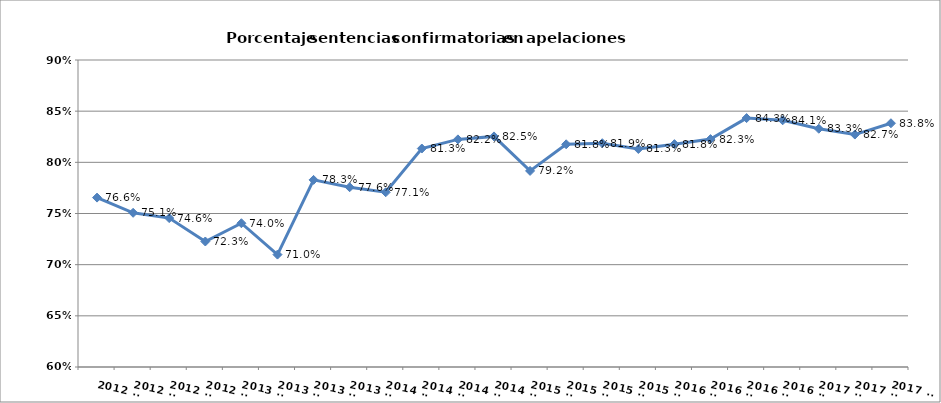
| Category | AP % confirmación |
|---|---|
| 2012 T1 | 0.766 |
| 2012 T2 | 0.751 |
| 2012 T3 | 0.746 |
| 2012 T4 | 0.723 |
| 2013 T1 | 0.74 |
| 2013 T2 | 0.71 |
| 2013 T3 | 0.783 |
| 2013 T4 | 0.776 |
| 2014 T1 | 0.771 |
| 2014 T2 | 0.813 |
| 2014 T3 | 0.822 |
| 2014 T4 | 0.825 |
| 2015 T1 | 0.792 |
| 2015 T2 | 0.818 |
| 2015 T3 | 0.819 |
| 2015 T4 | 0.813 |
| 2016 T1 | 0.818 |
| 2016 T2 | 0.823 |
| 2016 T3 | 0.843 |
| 2016 T4 | 0.841 |
| 2017 T1 | 0.833 |
| 2017 T2 | 0.827 |
| 2017 T3 | 0.838 |